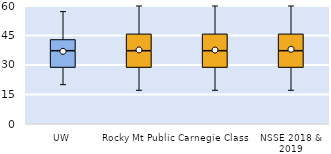
| Category | 25th | 50th | 75th |
|---|---|---|---|
| UW | 28.571 | 8.571 | 5.714 |
| Rocky Mt Public | 28.571 | 8.571 | 8.571 |
| Carnegie Class | 28.571 | 8.571 | 8.571 |
| NSSE 2018 & 2019 | 28.571 | 8.571 | 8.571 |